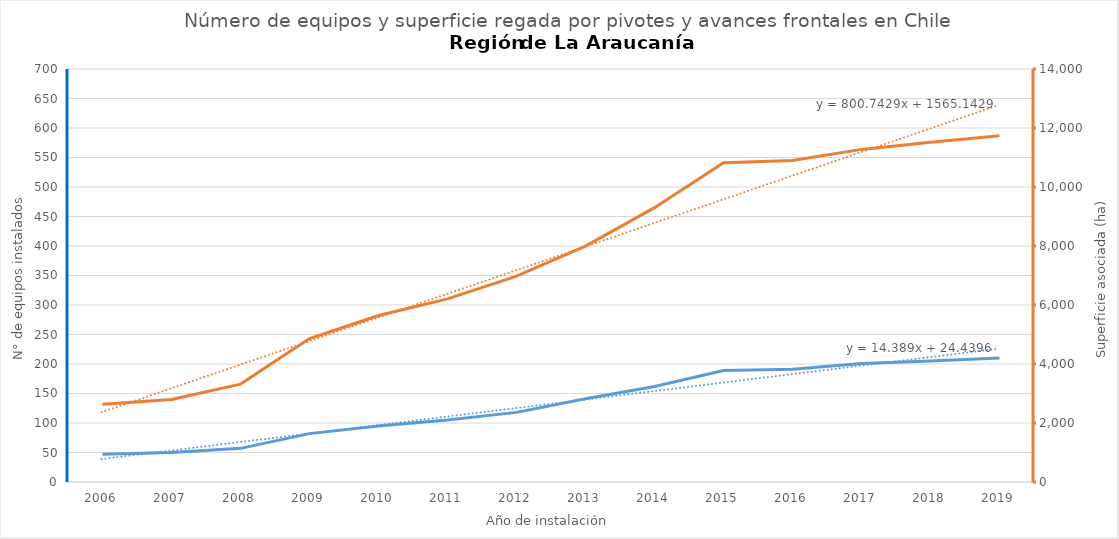
| Category | N° |
|---|---|
| 2006.0 | 47 |
| 2007.0 | 50 |
| 2008.0 | 57 |
| 2009.0 | 82 |
| 2010.0 | 95 |
| 2011.0 | 105 |
| 2012.0 | 118 |
| 2013.0 | 141 |
| 2014.0 | 162 |
| 2015.0 | 189 |
| 2016.0 | 191 |
| 2017.0 | 201 |
| 2018.0 | 205 |
| 2019.0 | 210 |